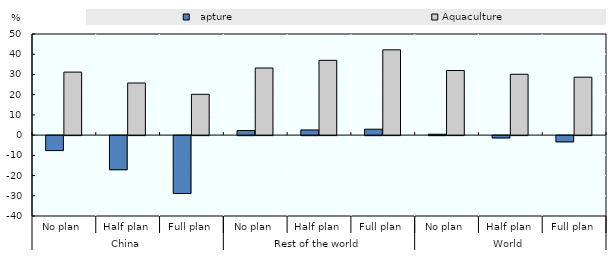
| Category | Capture | Aquaculture |
|---|---|---|
| 0 | -7.39 | 31.157 |
| 1 | -16.877 | 25.775 |
| 2 | -28.647 | 20.173 |
| 3 | 2.282 | 33.179 |
| 4 | 2.554 | 36.968 |
| 5 | 2.92 | 42.176 |
| 6 | 0.441 | 31.935 |
| 7 | -1.146 | 30.082 |
| 8 | -3.09 | 28.64 |